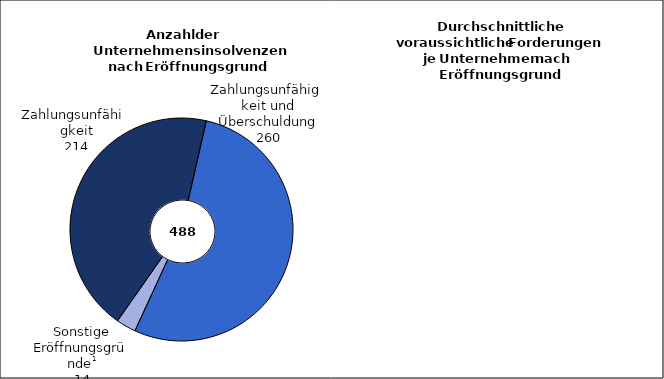
| Category | Series 0 | Series 1 |
|---|---|---|
| Zahlungsunfähigkeit | 214 | 228 |
|   Zahlungsunfähigkeit
   und Überschuldung | 260 | 840 |
|  Sonstige Eröffnungs-
                      gründe 2 | 14 | 665 |